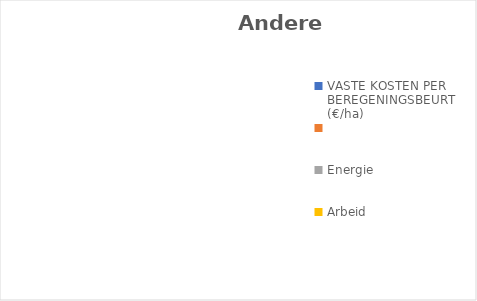
| Category | Andere teelt |
|---|---|
| VASTE KOSTEN PER BEREGENINGSBEURT  (€/ha)  | 0 |
| Energie | 0 |
| Arbeid | 0 |
| Wateraanvoer | 0 |